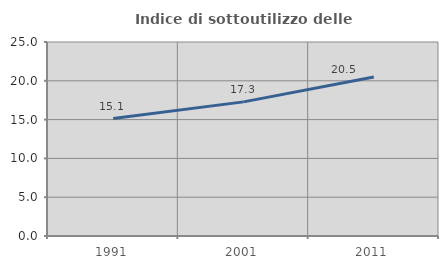
| Category | Indice di sottoutilizzo delle abitazioni  |
|---|---|
| 1991.0 | 15.133 |
| 2001.0 | 17.285 |
| 2011.0 | 20.497 |